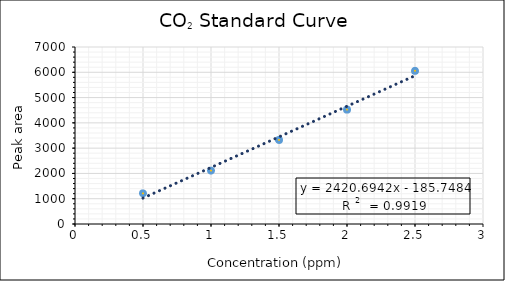
| Category | Series 0 |
|---|---|
| 0.5 | 1211.497 |
| 1.0 | 2111.497 |
| 1.5 | 3322.994 |
| 2.0 | 4522.994 |
| 2.5 | 6057.484 |